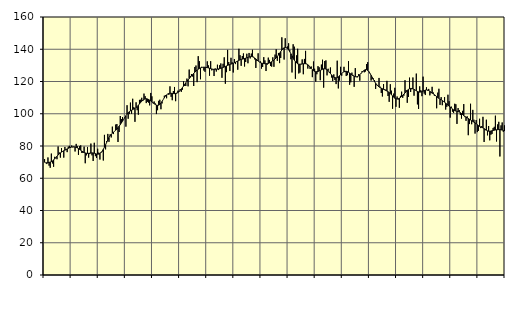
| Category | Piggar | Series 1 |
|---|---|---|
| nan | 71.9 | 69.92 |
| 87.0 | 69.6 | 69.56 |
| 87.0 | 68.8 | 69.63 |
| 87.0 | 72.9 | 69.75 |
| 87.0 | 67.8 | 69.85 |
| 87.0 | 66.5 | 70.02 |
| 87.0 | 75.3 | 70.28 |
| 87.0 | 69.2 | 70.74 |
| 87.0 | 67.1 | 71.33 |
| 87.0 | 73.3 | 72.04 |
| 87.0 | 72.6 | 72.84 |
| 87.0 | 71.8 | 73.66 |
| nan | 79.7 | 74.44 |
| 88.0 | 76 | 75.12 |
| 88.0 | 72.8 | 75.72 |
| 88.0 | 78.7 | 76.22 |
| 88.0 | 76.9 | 76.66 |
| 88.0 | 72.8 | 77.06 |
| 88.0 | 79.4 | 77.43 |
| 88.0 | 78 | 77.8 |
| 88.0 | 76.2 | 78.19 |
| 88.0 | 79.6 | 78.57 |
| 88.0 | 80.1 | 78.91 |
| 88.0 | 78.8 | 79.18 |
| nan | 80.3 | 79.35 |
| 89.0 | 79.2 | 79.43 |
| 89.0 | 79.7 | 79.43 |
| 89.0 | 76.6 | 79.32 |
| 89.0 | 81.3 | 79.11 |
| 89.0 | 79.9 | 78.81 |
| 89.0 | 74.5 | 78.4 |
| 89.0 | 79.9 | 77.91 |
| 89.0 | 80.4 | 77.4 |
| 89.0 | 75.7 | 76.88 |
| 89.0 | 75.7 | 76.4 |
| 89.0 | 79.6 | 76 |
| nan | 69.3 | 75.7 |
| 90.0 | 74.2 | 75.5 |
| 90.0 | 79.4 | 75.43 |
| 90.0 | 72.8 | 75.46 |
| 90.0 | 75 | 75.55 |
| 90.0 | 81.5 | 75.66 |
| 90.0 | 74.2 | 75.71 |
| 90.0 | 70.7 | 75.68 |
| 90.0 | 82 | 75.52 |
| 90.0 | 73.7 | 75.28 |
| 90.0 | 72.6 | 75.05 |
| 90.0 | 78.3 | 74.92 |
| nan | 75.9 | 74.98 |
| 91.0 | 71.6 | 75.31 |
| 91.0 | 76.3 | 75.91 |
| 91.0 | 76.5 | 76.8 |
| 91.0 | 71 | 77.94 |
| 91.0 | 86.9 | 79.26 |
| 91.0 | 77.9 | 80.74 |
| 91.0 | 83 | 82.34 |
| 91.0 | 87.5 | 83.89 |
| 91.0 | 82.6 | 85.24 |
| 91.0 | 87.2 | 86.37 |
| 91.0 | 85.3 | 87.26 |
| nan | 92 | 87.94 |
| 92.0 | 87.4 | 88.55 |
| 92.0 | 89.1 | 89.15 |
| 92.0 | 93.3 | 89.8 |
| 92.0 | 93.6 | 90.55 |
| 92.0 | 82.5 | 91.39 |
| 92.0 | 88.7 | 92.29 |
| 92.0 | 98.6 | 93.26 |
| 92.0 | 96.7 | 94.27 |
| 92.0 | 97.9 | 95.36 |
| 92.0 | 96.4 | 96.5 |
| 92.0 | 97.4 | 97.65 |
| nan | 92 | 98.77 |
| 93.0 | 105.3 | 99.77 |
| 93.0 | 96.9 | 100.61 |
| 93.0 | 99.8 | 101.27 |
| 93.0 | 106.9 | 101.78 |
| 93.0 | 100 | 102.2 |
| 93.0 | 109.3 | 102.58 |
| 93.0 | 104.1 | 102.94 |
| 93.0 | 95 | 103.33 |
| 93.0 | 107.1 | 103.83 |
| 93.0 | 102.2 | 104.48 |
| 93.0 | 99.4 | 105.26 |
| nan | 108.6 | 106.11 |
| 94.0 | 108.7 | 106.98 |
| 94.0 | 109.9 | 107.77 |
| 94.0 | 107.9 | 108.44 |
| 94.0 | 112.5 | 108.95 |
| 94.0 | 110.9 | 109.26 |
| 94.0 | 106.6 | 109.34 |
| 94.0 | 107.4 | 109.18 |
| 94.0 | 106.9 | 108.86 |
| 94.0 | 105.2 | 108.44 |
| 94.0 | 112.9 | 107.93 |
| 94.0 | 110.8 | 107.39 |
| nan | 106.5 | 106.83 |
| 95.0 | 107.6 | 106.25 |
| 95.0 | 106.4 | 105.74 |
| 95.0 | 99.8 | 105.37 |
| 95.0 | 102.2 | 105.21 |
| 95.0 | 108 | 105.32 |
| 95.0 | 108.7 | 105.79 |
| 95.0 | 102.8 | 106.59 |
| 95.0 | 106.4 | 107.62 |
| 95.0 | 108.8 | 108.79 |
| 95.0 | 111.2 | 109.95 |
| 95.0 | 111.5 | 110.96 |
| nan | 109.6 | 111.74 |
| 96.0 | 112.2 | 112.27 |
| 96.0 | 111.7 | 112.57 |
| 96.0 | 117 | 112.7 |
| 96.0 | 110.5 | 112.7 |
| 96.0 | 108.4 | 112.6 |
| 96.0 | 114.1 | 112.5 |
| 96.0 | 116.6 | 112.47 |
| 96.0 | 107.8 | 112.59 |
| 96.0 | 112.5 | 112.86 |
| 96.0 | 114.3 | 113.27 |
| 96.0 | 114.2 | 113.79 |
| nan | 115.3 | 114.45 |
| 97.0 | 113.6 | 115.27 |
| 97.0 | 114.9 | 116.19 |
| 97.0 | 120.1 | 117.17 |
| 97.0 | 117.3 | 118.18 |
| 97.0 | 117.2 | 119.18 |
| 97.0 | 121.8 | 120.1 |
| 97.0 | 117 | 120.97 |
| 97.0 | 127.4 | 121.8 |
| 97.0 | 123.4 | 122.63 |
| 97.0 | 124.6 | 123.44 |
| 97.0 | 123.1 | 124.25 |
| nan | 117.2 | 125.05 |
| 98.0 | 129 | 125.8 |
| 98.0 | 129.9 | 126.49 |
| 98.0 | 119.6 | 127.11 |
| 98.0 | 135.7 | 127.63 |
| 98.0 | 132.6 | 128.06 |
| 98.0 | 121.4 | 128.41 |
| 98.0 | 129.1 | 128.66 |
| 98.0 | 128.8 | 128.82 |
| 98.0 | 126.8 | 128.87 |
| 98.0 | 126 | 128.83 |
| 98.0 | 129 | 128.73 |
| nan | 132.5 | 128.6 |
| 99.0 | 130 | 128.42 |
| 99.0 | 123.6 | 128.21 |
| 99.0 | 132.6 | 128 |
| 99.0 | 126.9 | 127.78 |
| 99.0 | 127.7 | 127.59 |
| 99.0 | 123.4 | 127.52 |
| 99.0 | 128.1 | 127.54 |
| 99.0 | 126.2 | 127.58 |
| 99.0 | 130.4 | 127.68 |
| 99.0 | 127.1 | 127.83 |
| 99.0 | 130.1 | 128 |
| nan | 131.2 | 128.21 |
| 0.0 | 122.3 | 128.44 |
| 0.0 | 131 | 128.7 |
| 0.0 | 135 | 129 |
| 0.0 | 118.6 | 129.32 |
| 0.0 | 125.8 | 129.65 |
| 0.0 | 139.6 | 129.96 |
| 0.0 | 132.1 | 130.26 |
| 0.0 | 126.5 | 130.54 |
| 0.0 | 134.7 | 130.79 |
| 0.0 | 131.9 | 131.03 |
| 0.0 | 125.6 | 131.31 |
| nan | 133.9 | 131.61 |
| 1.0 | 130.8 | 131.96 |
| 1.0 | 132.1 | 132.35 |
| 1.0 | 127.3 | 132.74 |
| 1.0 | 140.3 | 133.11 |
| 1.0 | 136.3 | 133.47 |
| 1.0 | 129.7 | 133.72 |
| 1.0 | 135.8 | 133.87 |
| 1.0 | 137.4 | 134.04 |
| 1.0 | 129.3 | 134.25 |
| 1.0 | 132.1 | 134.47 |
| 1.0 | 137.2 | 134.71 |
| nan | 131.3 | 134.97 |
| 2.0 | 137.7 | 135.2 |
| 2.0 | 134.3 | 135.39 |
| 2.0 | 137.3 | 135.46 |
| 2.0 | 139.7 | 135.35 |
| 2.0 | 135.3 | 135.04 |
| 2.0 | 133.7 | 134.58 |
| 2.0 | 128.4 | 134 |
| 2.0 | 132.7 | 133.34 |
| 2.0 | 137.5 | 132.68 |
| 2.0 | 132.1 | 132.14 |
| 2.0 | 132.5 | 131.71 |
| nan | 128 | 131.42 |
| 3.0 | 129 | 131.25 |
| 3.0 | 135.1 | 131.12 |
| 3.0 | 133.1 | 131.04 |
| 3.0 | 126.5 | 131 |
| 3.0 | 130.4 | 131.04 |
| 3.0 | 134.8 | 131.23 |
| 3.0 | 133.4 | 131.51 |
| 3.0 | 129.6 | 131.86 |
| 3.0 | 129.2 | 132.27 |
| 3.0 | 135 | 132.74 |
| 3.0 | 129.1 | 133.29 |
| nan | 136.7 | 133.94 |
| 4.0 | 140 | 134.69 |
| 4.0 | 132.8 | 135.52 |
| 4.0 | 137.7 | 136.43 |
| 4.0 | 131.4 | 137.48 |
| 4.0 | 134.6 | 138.56 |
| 4.0 | 147.4 | 139.53 |
| 4.0 | 140.8 | 140.33 |
| 4.0 | 133.6 | 140.9 |
| 4.0 | 146.8 | 141.11 |
| 4.0 | 141.1 | 140.94 |
| 4.0 | 141.7 | 140.43 |
| nan | 143.7 | 139.61 |
| 5.0 | 139.7 | 138.49 |
| 5.0 | 133.8 | 137.2 |
| 5.0 | 125.6 | 135.88 |
| 5.0 | 143.1 | 134.56 |
| 5.0 | 141.6 | 133.35 |
| 5.0 | 121.7 | 132.3 |
| 5.0 | 136.2 | 131.49 |
| 5.0 | 140.3 | 130.98 |
| 5.0 | 125 | 130.75 |
| 5.0 | 125.5 | 130.72 |
| 5.0 | 130.6 | 130.79 |
| nan | 133.7 | 130.89 |
| 6.0 | 124.5 | 130.98 |
| 6.0 | 134 | 131.05 |
| 6.0 | 139 | 131.02 |
| 6.0 | 131 | 130.81 |
| 6.0 | 128 | 130.37 |
| 6.0 | 129.5 | 129.76 |
| 6.0 | 127.8 | 129 |
| 6.0 | 129.3 | 128.16 |
| 6.0 | 122.7 | 127.37 |
| 6.0 | 132.4 | 126.74 |
| 6.0 | 127.9 | 126.31 |
| nan | 119.9 | 126.09 |
| 7.0 | 124.5 | 126.09 |
| 7.0 | 129.5 | 126.27 |
| 7.0 | 128.8 | 126.53 |
| 7.0 | 120.8 | 126.86 |
| 7.0 | 130.5 | 127.23 |
| 7.0 | 133.5 | 127.59 |
| 7.0 | 116.2 | 127.85 |
| 7.0 | 132.7 | 127.9 |
| 7.0 | 133.1 | 127.72 |
| 7.0 | 123.8 | 127.31 |
| 7.0 | 127.9 | 126.66 |
| nan | 125.5 | 125.86 |
| 8.0 | 128.7 | 124.99 |
| 8.0 | 122.5 | 124.1 |
| 8.0 | 120.3 | 123.28 |
| 8.0 | 124.4 | 122.67 |
| 8.0 | 120.9 | 122.34 |
| 8.0 | 118.4 | 122.25 |
| 8.0 | 132.9 | 122.44 |
| 8.0 | 115.7 | 122.9 |
| 8.0 | 120.6 | 123.52 |
| 8.0 | 129.1 | 124.22 |
| 8.0 | 123.6 | 124.97 |
| nan | 125.6 | 125.61 |
| 9.0 | 129.1 | 126.07 |
| 9.0 | 125.8 | 126.31 |
| 9.0 | 123.4 | 126.32 |
| 9.0 | 123.9 | 126.13 |
| 9.0 | 132.6 | 125.77 |
| 9.0 | 118 | 125.28 |
| 9.0 | 119.5 | 124.7 |
| 9.0 | 125.5 | 124.1 |
| 9.0 | 124.1 | 123.61 |
| 9.0 | 116.7 | 123.24 |
| 9.0 | 128.3 | 122.99 |
| nan | 122.7 | 122.93 |
| 10.0 | 122.6 | 123.09 |
| 10.0 | 124.6 | 123.51 |
| 10.0 | 120.5 | 124.16 |
| 10.0 | 125.2 | 124.96 |
| 10.0 | 126.4 | 125.77 |
| 10.0 | 126.4 | 126.49 |
| 10.0 | 125.7 | 127.05 |
| 10.0 | 126.2 | 127.37 |
| 10.0 | 130.8 | 127.32 |
| 10.0 | 132 | 126.9 |
| 10.0 | 125.8 | 126.13 |
| nan | 125.3 | 125.08 |
| 11.0 | 120.6 | 123.87 |
| 11.0 | 121.5 | 122.57 |
| 11.0 | 121.9 | 121.27 |
| 11.0 | 120.9 | 120.03 |
| 11.0 | 115.4 | 118.91 |
| 11.0 | 117.7 | 118 |
| 11.0 | 117.3 | 117.27 |
| 11.0 | 122.2 | 116.69 |
| 11.0 | 116.8 | 116.25 |
| 11.0 | 112.9 | 115.87 |
| 11.0 | 110.7 | 115.5 |
| nan | 118.4 | 115.15 |
| 12.0 | 115.2 | 114.81 |
| 12.0 | 114.9 | 114.46 |
| 12.0 | 120.4 | 114.08 |
| 12.0 | 111 | 113.65 |
| 12.0 | 107.4 | 113.13 |
| 12.0 | 118.3 | 112.51 |
| 12.0 | 114.3 | 111.82 |
| 12.0 | 103.1 | 111.03 |
| 12.0 | 112.5 | 110.24 |
| 12.0 | 116.1 | 109.62 |
| 12.0 | 104.3 | 109.27 |
| nan | 110.7 | 109.18 |
| 13.0 | 108.8 | 109.31 |
| 13.0 | 103.7 | 109.64 |
| 13.0 | 111.1 | 110.11 |
| 13.0 | 113.7 | 110.7 |
| 13.0 | 109.9 | 111.43 |
| 13.0 | 111.2 | 112.18 |
| 13.0 | 120.8 | 112.92 |
| 13.0 | 114.6 | 113.71 |
| 13.0 | 106.8 | 114.48 |
| 13.0 | 110.4 | 115.09 |
| 13.0 | 122.4 | 115.52 |
| nan | 113.5 | 115.71 |
| 14.0 | 115.2 | 115.67 |
| 14.0 | 122.5 | 115.46 |
| 14.0 | 111.2 | 115.12 |
| 14.0 | 114.7 | 114.7 |
| 14.0 | 124.9 | 114.24 |
| 14.0 | 105.8 | 113.85 |
| 14.0 | 103 | 113.57 |
| 14.0 | 117 | 113.42 |
| 14.0 | 114.6 | 113.47 |
| 14.0 | 110.9 | 113.7 |
| 14.0 | 123 | 114.02 |
| nan | 112.5 | 114.36 |
| 15.0 | 111.6 | 114.66 |
| 15.0 | 116.4 | 114.77 |
| 15.0 | 114.4 | 114.67 |
| 15.0 | 115.4 | 114.38 |
| 15.0 | 111.4 | 113.92 |
| 15.0 | 112.7 | 113.38 |
| 15.0 | 116.7 | 112.85 |
| 15.0 | 113.2 | 112.34 |
| 15.0 | 111.2 | 111.81 |
| 15.0 | 111 | 111.25 |
| 15.0 | 103.4 | 110.65 |
| nan | 113.1 | 110.06 |
| 16.0 | 115.5 | 109.53 |
| 16.0 | 105.5 | 109.06 |
| 16.0 | 110.3 | 108.63 |
| 16.0 | 105.3 | 108.19 |
| 16.0 | 107.9 | 107.71 |
| 16.0 | 110.3 | 107.19 |
| 16.0 | 102.6 | 106.62 |
| 16.0 | 104.3 | 105.99 |
| 16.0 | 111.8 | 105.35 |
| 16.0 | 107.8 | 104.74 |
| 16.0 | 97.6 | 104.16 |
| nan | 104.4 | 103.58 |
| 17.0 | 101.3 | 102.98 |
| 17.0 | 100.5 | 102.43 |
| 17.0 | 106.2 | 101.98 |
| 17.0 | 105.9 | 101.67 |
| 17.0 | 93.7 | 101.49 |
| 17.0 | 103.5 | 101.31 |
| 17.0 | 102.3 | 101.05 |
| 17.0 | 99.2 | 100.67 |
| 17.0 | 97 | 100.13 |
| 17.0 | 101.8 | 99.5 |
| 17.0 | 106 | 98.86 |
| nan | 97.9 | 98.31 |
| 18.0 | 95.6 | 97.85 |
| 18.0 | 98.4 | 97.43 |
| 18.0 | 86.7 | 97.03 |
| 18.0 | 93.6 | 96.6 |
| 18.0 | 106.2 | 96.15 |
| 18.0 | 93.5 | 95.71 |
| 18.0 | 102.4 | 95.28 |
| 18.0 | 96.3 | 94.8 |
| 18.0 | 87.7 | 94.31 |
| 18.0 | 96.1 | 93.76 |
| 18.0 | 88.6 | 93.2 |
| nan | 89.4 | 92.66 |
| 19.0 | 96.9 | 92.21 |
| 19.0 | 91.1 | 91.86 |
| 19.0 | 92.4 | 91.55 |
| 19.0 | 98.1 | 91.21 |
| 19.0 | 82.5 | 90.8 |
| 19.0 | 89.8 | 90.31 |
| 19.0 | 96.3 | 89.8 |
| 19.0 | 86.6 | 89.4 |
| 19.0 | 92.4 | 89.19 |
| 19.0 | 83.5 | 89.16 |
| 19.0 | 87 | 89.26 |
| nan | 87.5 | 89.44 |
| 20.0 | 91.2 | 89.63 |
| 20.0 | 91.9 | 89.79 |
| 20.0 | 98.8 | 89.93 |
| 20.0 | 82.8 | 90.04 |
| 20.0 | 93.4 | 90.12 |
| 20.0 | 95 | 90.19 |
| 20.0 | 73.5 | 90.17 |
| 20.0 | 92.8 | 90.06 |
| 20.0 | 94.6 | 89.88 |
| 20.0 | 88.8 | 89.61 |
| 20.0 | 92.8 | 89.27 |